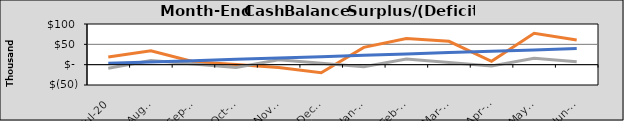
| Category | Final Cash | Original Cash | Revised Cash |
|---|---|---|---|
| 2020-07-01 | 18994.867 | -8659.158 | 3290.909 |
| 2020-08-01 | 34331.735 | 10444.933 | 6581.818 |
| 2020-09-01 | 7374.852 | 1785.775 | 9872.727 |
| 2020-10-02 | 197.569 | -6873.384 | 13163.636 |
| 2020-11-02 | -6715.963 | 12230.708 | 16454.545 |
| 2020-12-03 | -19669.496 | 3571.549 | 19745.454 |
| 2021-01-03 | 42606.971 | -5087.609 | 23036.363 |
| 2021-02-03 | 64031.689 | 14016.482 | 26327.272 |
| 2021-03-06 | 57498.406 | 5357.324 | 29618.181 |
| 2021-04-06 | 8369.873 | -3301.835 | 32909.09 |
| 2021-05-07 | 77106.341 | 15802.257 | 36199.999 |
| 2021-06-07 | 60639.381 | 7143.099 | 39490.908 |